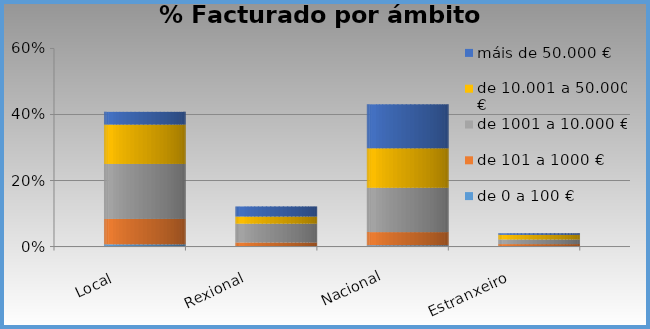
| Category | de 0 a 100 € | de 101 a 1000 € | de 1001 a 10.000 € | de 10.001 a 50.000 € | máis de 50.000 € |
|---|---|---|---|---|---|
| Local | 0.007 | 0.077 | 0.167 | 0.119 | 0.038 |
| Rexional | 0.001 | 0.012 | 0.057 | 0.022 | 0.03 |
| Nacional | 0.004 | 0.04 | 0.134 | 0.12 | 0.133 |
| Estranxeiro | 0 | 0.007 | 0.014 | 0.014 | 0.004 |